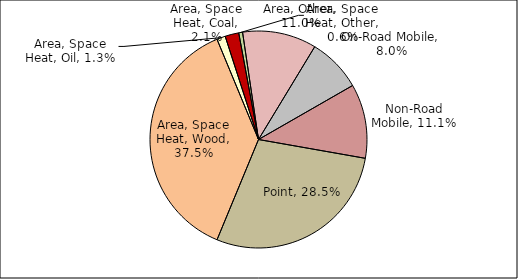
| Category | Series 0 |
|---|---|
| Point | 0.285 |
| Area, Space Heat, Wood | 0.375 |
| Area, Space Heat, Oil | 0.013 |
| Area, Space Heat, Coal | 0.021 |
| Area, Space Heat, Other | 0.006 |
| Area, Other | 0.11 |
| On-Road Mobile | 0.08 |
| Non-Road Mobile | 0.111 |